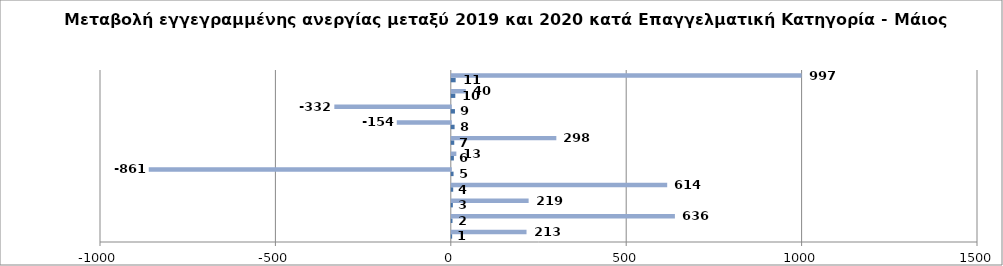
| Category | Series 0 | Series 1 |
|---|---|---|
| 0 | 1 | 213 |
| 1 | 2 | 636 |
| 2 | 3 | 219 |
| 3 | 4 | 614 |
| 4 | 5 | -861 |
| 5 | 6 | 13 |
| 6 | 7 | 298 |
| 7 | 8 | -154 |
| 8 | 9 | -332 |
| 9 | 10 | 40 |
| 10 | 11 | 997 |